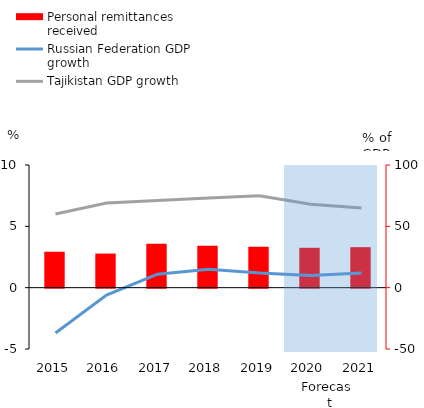
| Category | Personal remittances received |
|---|---|
| 0 | 29.3 |
| 1 | 27.8 |
| 2 | 35.7 |
| 3 | 34.1 |
| 4 | 33.4 |
| 5 | 32.5 |
| 6 | 33 |